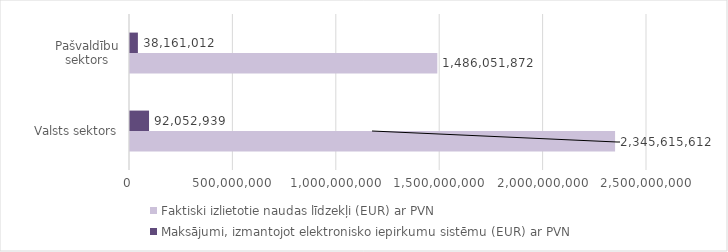
| Category | Faktiski izlietotie naudas līdzekļi (EUR) ar PVN | Maksājumi, izmantojot elektronisko iepirkumu sistēmu (EUR) ar PVN |
|---|---|---|
| Valsts sektors | 2345615612 | 92052939 |
| Pašvaldību sektors | 1486051872 | 38161012 |